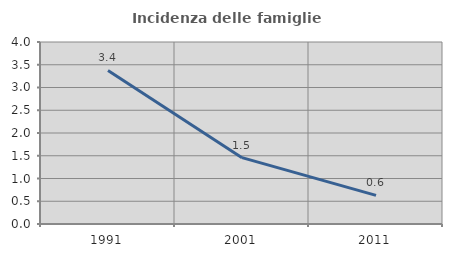
| Category | Incidenza delle famiglie numerose |
|---|---|
| 1991.0 | 3.375 |
| 2001.0 | 1.458 |
| 2011.0 | 0.629 |